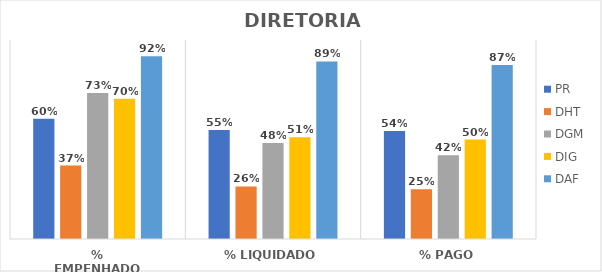
| Category | PR | DHT | DGM | DIG | DAF |
|---|---|---|---|---|---|
| % EMPENHADO | 0.605 | 0.369 | 0.733 | 0.704 | 0.919 |
| % LIQUIDADO | 0.547 | 0.264 | 0.483 | 0.511 | 0.893 |
| % PAGO | 0.542 | 0.25 | 0.421 | 0.5 | 0.874 |